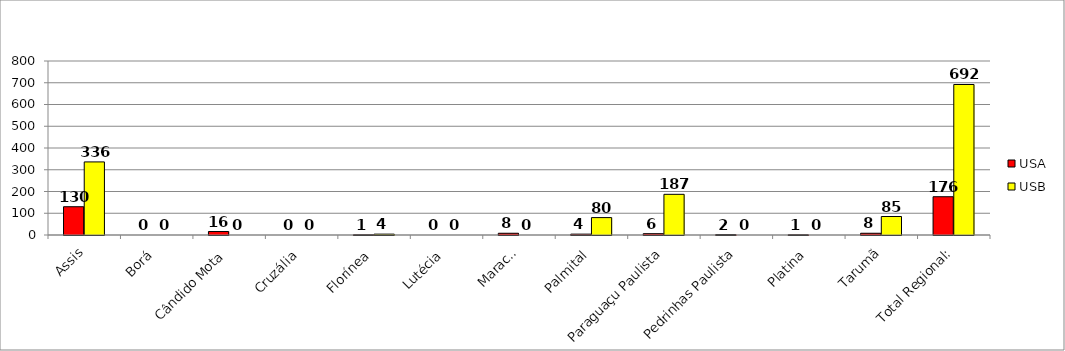
| Category | USA | USB |
|---|---|---|
| Assis | 130 | 336 |
| Borá | 0 | 0 |
| Cândido Mota | 16 | 0 |
| Cruzália | 0 | 0 |
| Florínea | 1 | 4 |
| Lutécia | 0 | 0 |
| Maracaí | 8 | 0 |
| Palmital | 4 | 80 |
| Paraguaçu Paulista | 6 | 187 |
| Pedrinhas Paulista | 2 | 0 |
| Platina | 1 | 0 |
| Tarumã | 8 | 85 |
| Total Regional: | 176 | 692 |